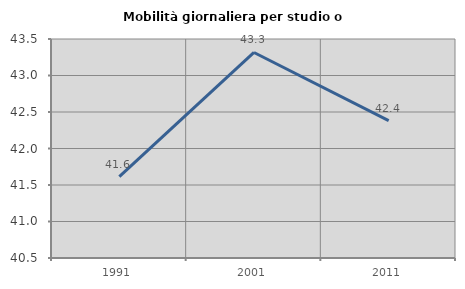
| Category | Mobilità giornaliera per studio o lavoro |
|---|---|
| 1991.0 | 41.614 |
| 2001.0 | 43.316 |
| 2011.0 | 42.381 |